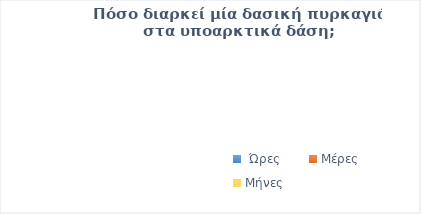
| Category | Series 0 |
|---|---|
|  Ώρες | 0 |
| Μέρες | 0 |
| Μήνες | 0 |